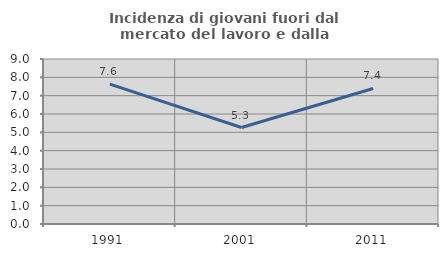
| Category | Incidenza di giovani fuori dal mercato del lavoro e dalla formazione  |
|---|---|
| 1991.0 | 7.63 |
| 2001.0 | 5.263 |
| 2011.0 | 7.393 |